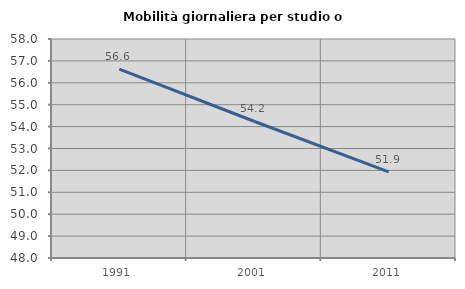
| Category | Mobilità giornaliera per studio o lavoro |
|---|---|
| 1991.0 | 56.627 |
| 2001.0 | 54.244 |
| 2011.0 | 51.933 |